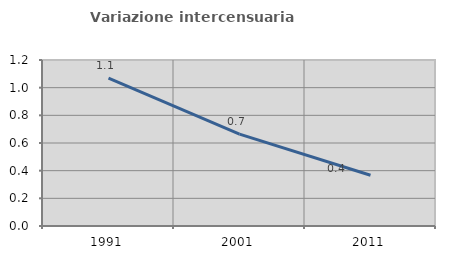
| Category | Variazione intercensuaria annua |
|---|---|
| 1991.0 | 1.068 |
| 2001.0 | 0.664 |
| 2011.0 | 0.367 |